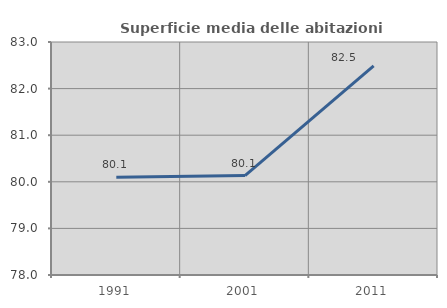
| Category | Superficie media delle abitazioni occupate |
|---|---|
| 1991.0 | 80.098 |
| 2001.0 | 80.135 |
| 2011.0 | 82.486 |